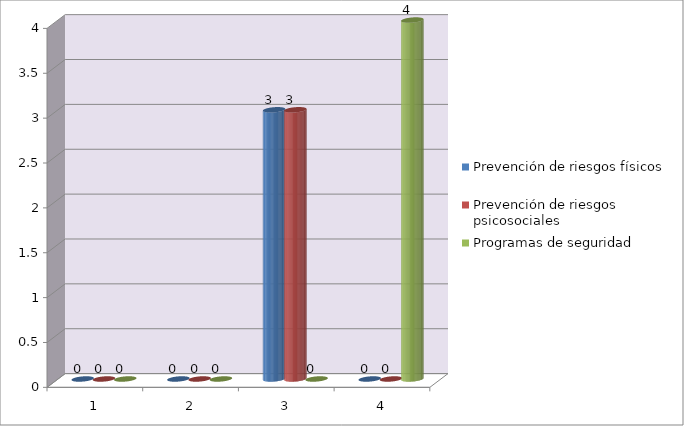
| Category | Prevención de riesgos físicos | Prevención de riesgos
psicosociales | Programas de seguridad |
|---|---|---|---|
| 0 | 0 | 0 | 0 |
| 1 | 0 | 0 | 0 |
| 2 | 3 | 3 | 0 |
| 3 | 0 | 0 | 4 |